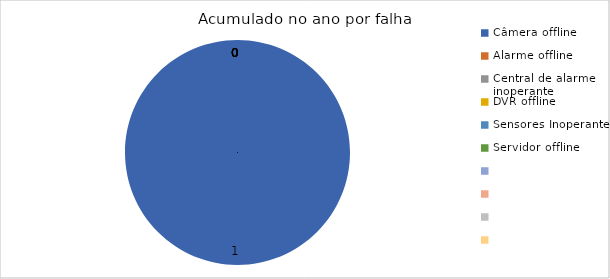
| Category | Total |
|---|---|
| Câmera offline | 1 |
| Alarme offline | 0 |
| Central de alarme inoperante | 0 |
| DVR offline | 0 |
| Sensores Inoperantes | 0 |
| Servidor offline | 0 |